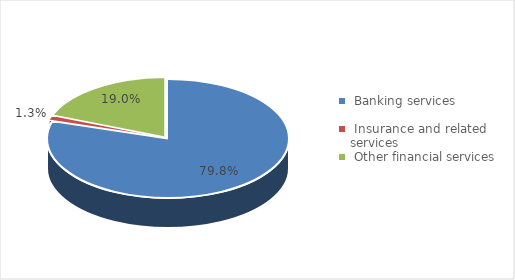
| Category | Enterprises  |
|---|---|
|  Banking services  | 0.798 |
|  Insurance and related services  | 0.013 |
|  Other financial services  | 0.19 |